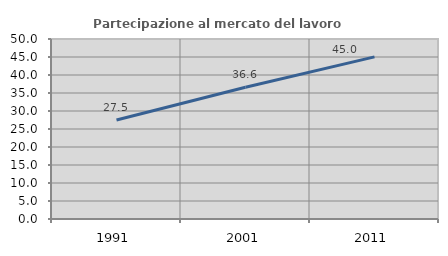
| Category | Partecipazione al mercato del lavoro  femminile |
|---|---|
| 1991.0 | 27.509 |
| 2001.0 | 36.591 |
| 2011.0 | 45.025 |